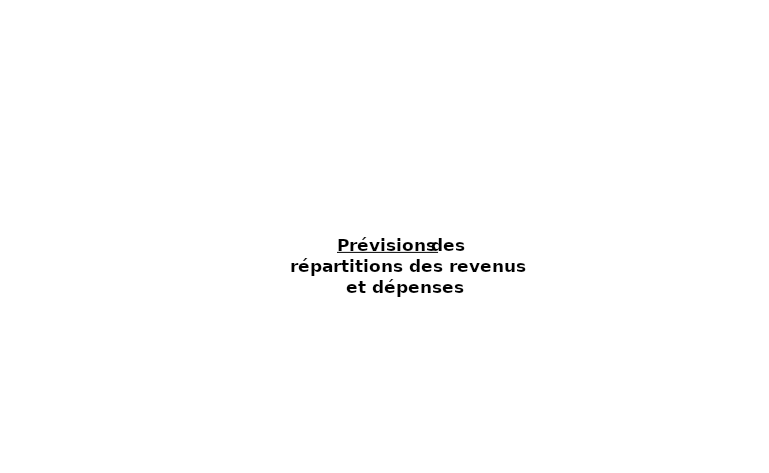
| Category | Series 0 |
|---|---|
| Total de vos revenus | 0 |
| Total des dépenses vitales | 0 |
| Total des dépenses accessoires | 0 |